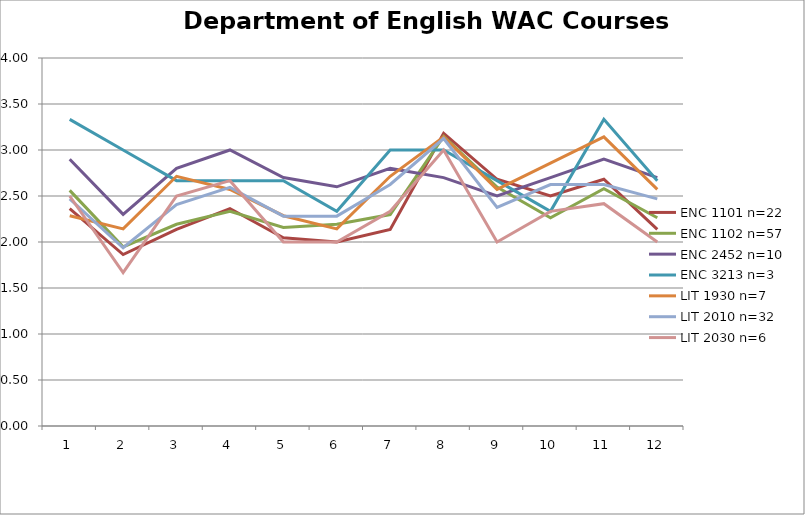
| Category | ENC 1101 n=22 | ENC 1102 n=57 | ENC 2452 n=10 | ENC 3213 n=3 | LIT 1930 n=7 | LIT 2010 n=32 | LIT 2030 n=6 |
|---|---|---|---|---|---|---|---|
| 0 | 2.364 | 2.561 | 2.9 | 3.333 | 2.286 | 2.469 | 2.5 |
| 1 | 1.864 | 1.947 | 2.3 | 3 | 2.143 | 1.938 | 1.667 |
| 2 | 2.136 | 2.193 | 2.8 | 2.667 | 2.714 | 2.406 | 2.5 |
| 3 | 2.364 | 2.333 | 3 | 2.667 | 2.571 | 2.594 | 2.667 |
| 4 | 2.045 | 2.158 | 2.7 | 2.667 | 2.286 | 2.281 | 2 |
| 5 | 2 | 2.193 | 2.6 | 2.333 | 2.143 | 2.281 | 2 |
| 6 | 2.136 | 2.298 | 2.8 | 3 | 2.714 | 2.625 | 2.333 |
| 7 | 3.182 | 3.149 | 2.7 | 3 | 3.143 | 3.125 | 3 |
| 8 | 2.682 | 2.596 | 2.5 | 2.667 | 2.571 | 2.375 | 2 |
| 9 | 2.5 | 2.263 | 2.7 | 2.333 | 2.857 | 2.625 | 2.333 |
| 10 | 2.682 | 2.579 | 2.9 | 3.333 | 3.143 | 2.625 | 2.417 |
| 11 | 2.136 | 2.263 | 2.7 | 2.667 | 2.571 | 2.469 | 2 |